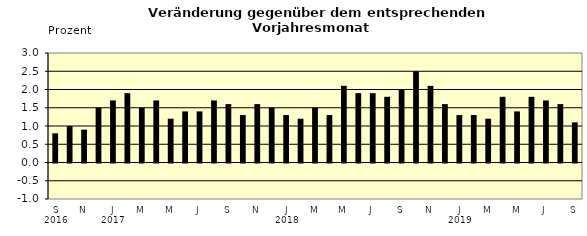
| Category | Series 0 |
|---|---|
| 0 | 0.8 |
| 1 | 1 |
| 2 | 0.9 |
| 3 | 1.5 |
| 4 | 1.7 |
| 5 | 1.9 |
| 6 | 1.5 |
| 7 | 1.7 |
| 8 | 1.2 |
| 9 | 1.4 |
| 10 | 1.4 |
| 11 | 1.7 |
| 12 | 1.6 |
| 13 | 1.3 |
| 14 | 1.6 |
| 15 | 1.5 |
| 16 | 1.3 |
| 17 | 1.2 |
| 18 | 1.5 |
| 19 | 1.3 |
| 20 | 2.1 |
| 21 | 1.9 |
| 22 | 1.9 |
| 23 | 1.8 |
| 24 | 2 |
| 25 | 2.5 |
| 26 | 2.1 |
| 27 | 1.6 |
| 28 | 1.3 |
| 29 | 1.3 |
| 30 | 1.2 |
| 31 | 1.8 |
| 32 | 1.4 |
| 33 | 1.8 |
| 34 | 1.7 |
| 35 | 1.6 |
| 36 | 1.1 |